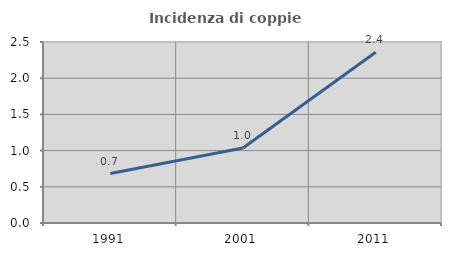
| Category | Incidenza di coppie miste |
|---|---|
| 1991.0 | 0.683 |
| 2001.0 | 1.036 |
| 2011.0 | 2.357 |